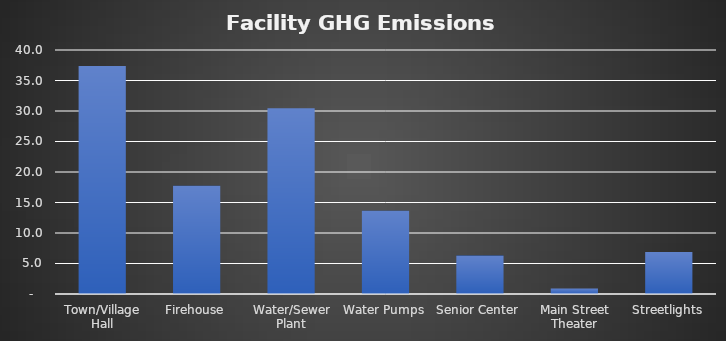
| Category | GHG Emissions (tons) |
|---|---|
| Town/Village Hall | 37.392 |
| Firehouse | 17.734 |
| Water/Sewer Plant | 30.44 |
| Water Pumps | 13.666 |
| Senior Center | 6.291 |
| Main Street Theater | 0.913 |
| Streetlights | 6.887 |